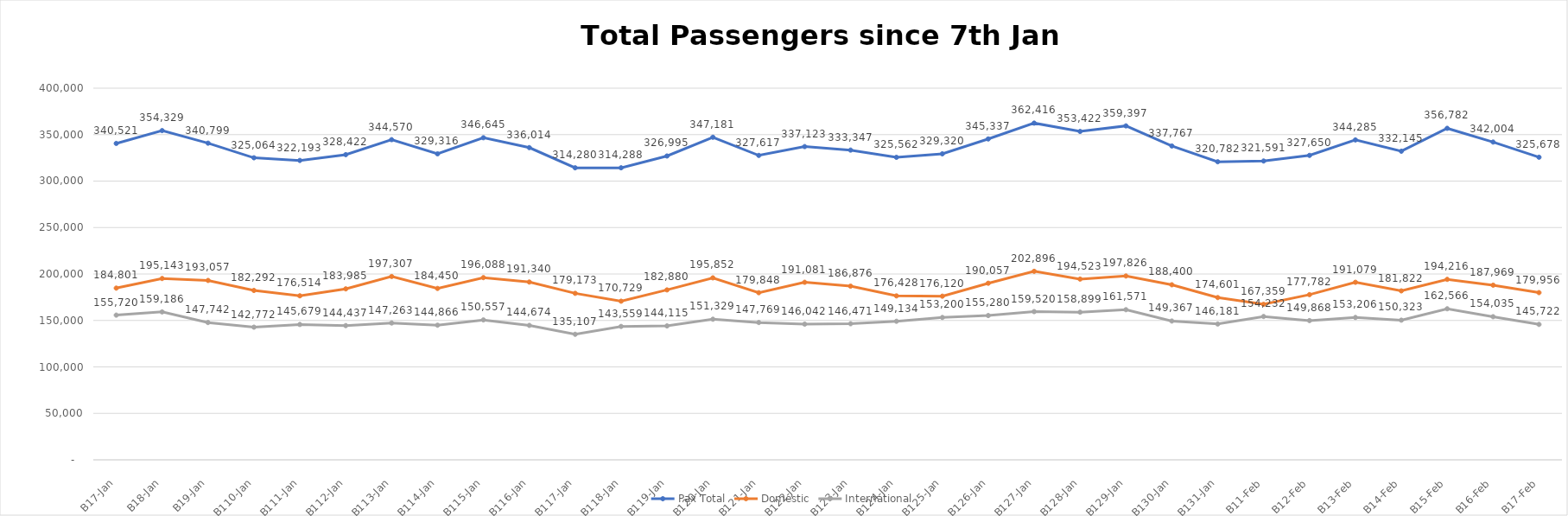
| Category | Pax Total |  Domestic  |  International  |
|---|---|---|---|
| 2023-01-07 | 340521 | 184801 | 155720 |
| 2023-01-08 | 354329 | 195143 | 159186 |
| 2023-01-09 | 340799 | 193057 | 147742 |
| 2023-01-10 | 325064 | 182292 | 142772 |
| 2023-01-11 | 322193 | 176514 | 145679 |
| 2023-01-12 | 328422 | 183985 | 144437 |
| 2023-01-13 | 344570 | 197307 | 147263 |
| 2023-01-14 | 329316 | 184450 | 144866 |
| 2023-01-15 | 346645 | 196088 | 150557 |
| 2023-01-16 | 336014 | 191340 | 144674 |
| 2023-01-17 | 314280 | 179173 | 135107 |
| 2023-01-18 | 314288 | 170729 | 143559 |
| 2023-01-19 | 326995 | 182880 | 144115 |
| 2023-01-20 | 347181 | 195852 | 151329 |
| 2023-01-21 | 327617 | 179848 | 147769 |
| 2023-01-22 | 337123 | 191081 | 146042 |
| 2023-01-23 | 333347 | 186876 | 146471 |
| 2023-01-24 | 325562 | 176428 | 149134 |
| 2023-01-25 | 329320 | 176120 | 153200 |
| 2023-01-26 | 345337 | 190057 | 155280 |
| 2023-01-27 | 362416 | 202896 | 159520 |
| 2023-01-28 | 353422 | 194523 | 158899 |
| 2023-01-29 | 359397 | 197826 | 161571 |
| 2023-01-30 | 337767 | 188400 | 149367 |
| 2023-01-31 | 320782 | 174601 | 146181 |
| 2023-02-01 | 321591 | 167359 | 154232 |
| 2023-02-02 | 327650 | 177782 | 149868 |
| 2023-02-03 | 344285 | 191079 | 153206 |
| 2023-02-04 | 332145 | 181822 | 150323 |
| 2023-02-05 | 356782 | 194216 | 162566 |
| 2023-02-06 | 342004 | 187969 | 154035 |
| 2023-02-07 | 325678 | 179956 | 145722 |